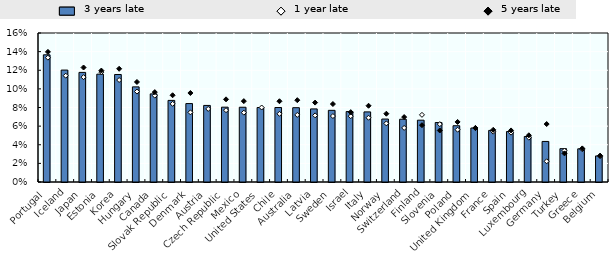
| Category | 3yrs late |
|---|---|
| Portugal | 0.137 |
| Iceland | 0.12 |
| Japan | 0.118 |
| Estonia | 0.116 |
| Korea | 0.115 |
| Hungary | 0.102 |
| Canada | 0.095 |
| Slovak Republic | 0.088 |
| Denmark | 0.084 |
| Austria | 0.082 |
| Czech Republic | 0.08 |
| Mexico | 0.08 |
| United States | 0.08 |
| Chile | 0.08 |
| Australia | 0.08 |
| Latvia | 0.078 |
| Sweden | 0.077 |
| Israel | 0.076 |
| Italy | 0.075 |
| Norway | 0.068 |
| Switzerland | 0.067 |
| Finland | 0.066 |
| Slovenia | 0.064 |
| Poland | 0.06 |
| United Kingdom | 0.058 |
| France | 0.055 |
| Spain | 0.054 |
| Luxembourg | 0.049 |
| Germany | 0.044 |
| Turkey | 0.036 |
| Greece | 0.036 |
| Belgium | 0.028 |